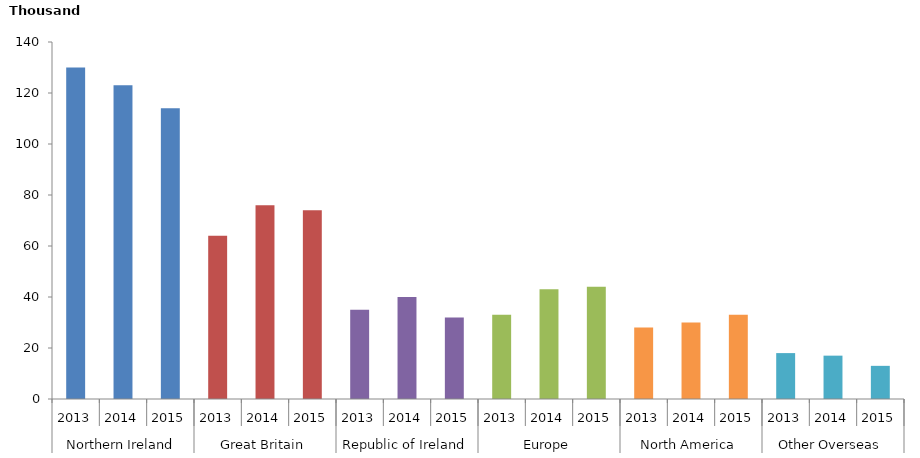
| Category | Number |
|---|---|
| 0 | 130 |
| 1 | 123 |
| 2 | 114 |
| 3 | 64 |
| 4 | 76 |
| 5 | 74 |
| 6 | 35 |
| 7 | 40 |
| 8 | 32 |
| 9 | 33 |
| 10 | 43 |
| 11 | 44 |
| 12 | 28 |
| 13 | 30 |
| 14 | 33 |
| 15 | 18 |
| 16 | 17 |
| 17 | 13 |